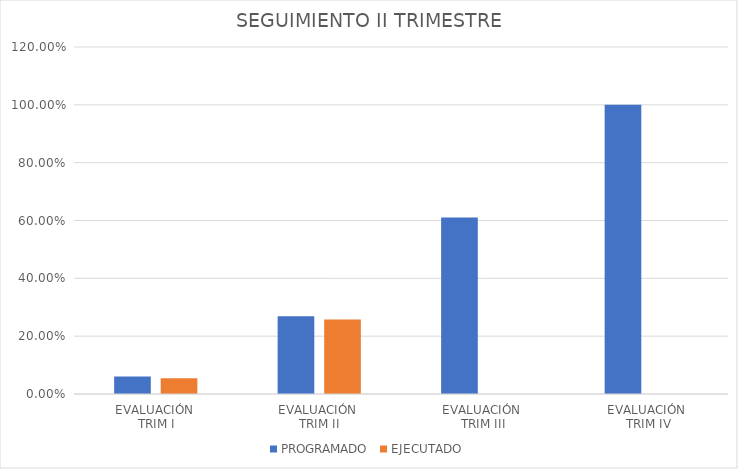
| Category | PROGRAMADO | EJECUTADO |
|---|---|---|
| EVALUACIÓN 
TRIM I | 0.06 | 0.055 |
| EVALUACIÓN 
TRIM II | 0.269 | 0.257 |
| EVALUACIÓN 
TRIM III | 0.61 | 0 |
| EVALUACIÓN
 TRIM IV | 1 | 0 |